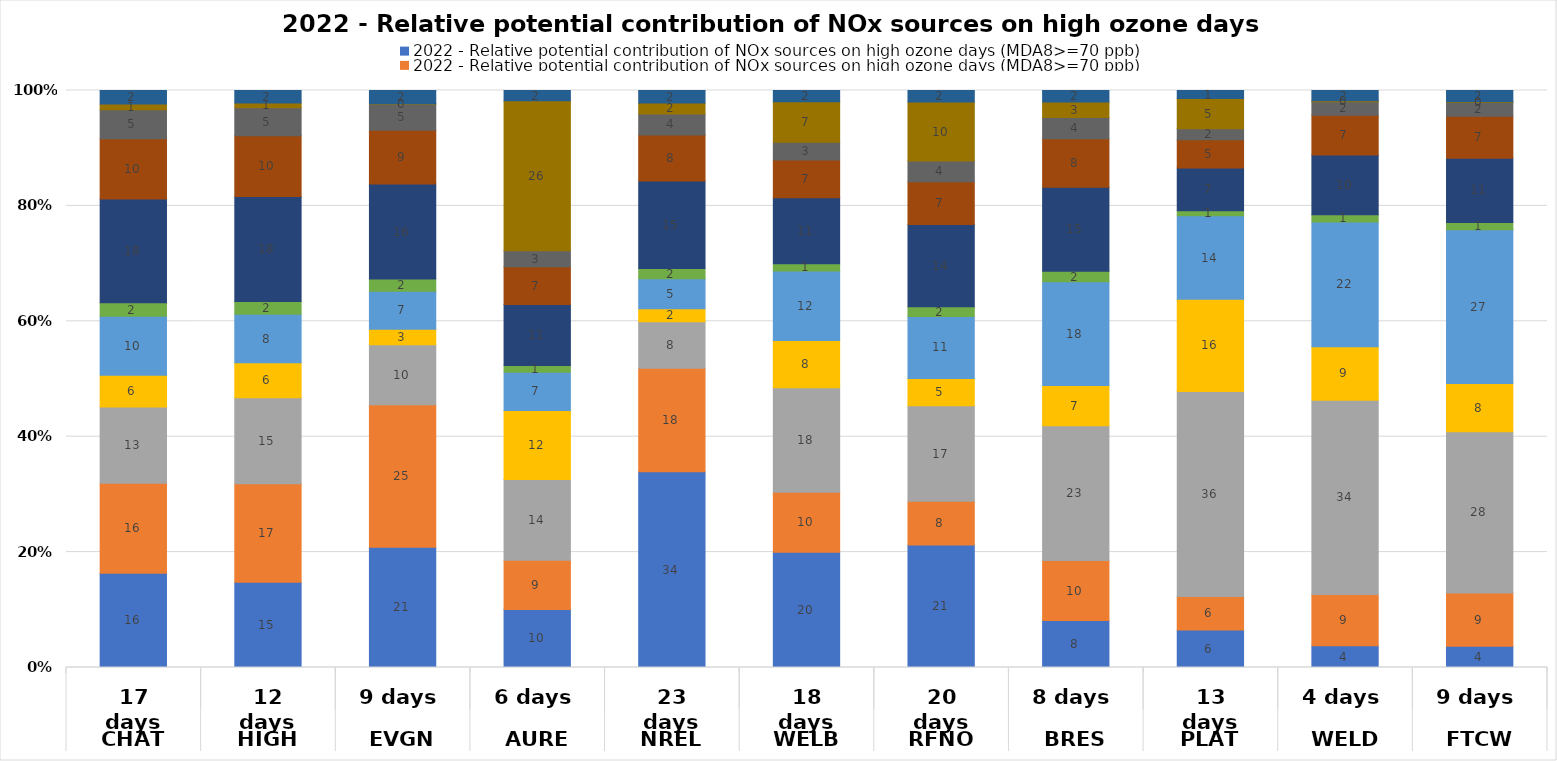
| Category | EGU Point | Non-EGU Point | O&G Area | O&G Point | O&G pre-production | Nonpoint | On-road Mobile | Other Non-road Mobile | Lawn & Garden Equipment | Airports | Rail |
|---|---|---|---|---|---|---|---|---|---|---|---|
| 0 | 16.313 | 15.605 | 13.244 | 5.505 | 10.202 | 2.337 | 18.007 | 10.417 | 5.023 | 0.996 | 2.351 |
| 1 | 14.762 | 17.088 | 14.905 | 6.065 | 8.383 | 2.246 | 18.194 | 10.494 | 4.868 | 0.81 | 2.185 |
| 2 | 20.833 | 24.686 | 10.408 | 2.698 | 6.561 | 2.132 | 16.47 | 9.313 | 4.527 | 0.088 | 2.284 |
| 3 | 10.055 | 8.516 | 14.014 | 11.974 | 6.603 | 1.179 | 10.588 | 6.51 | 2.793 | 25.974 | 1.793 |
| 4 | 33.911 | 17.93 | 8.088 | 2.236 | 5.201 | 1.787 | 15.167 | 7.966 | 3.657 | 1.886 | 2.17 |
| 5 | 19.966 | 10.422 | 18.088 | 8.212 | 12.029 | 1.278 | 11.397 | 6.548 | 3.09 | 7.022 | 1.948 |
| 6 | 21.236 | 7.564 | 16.561 | 4.737 | 10.745 | 1.682 | 14.233 | 7.416 | 3.597 | 10.233 | 1.996 |
| 7 | 8.139 | 10.402 | 23.373 | 6.944 | 17.977 | 1.823 | 14.58 | 8.4 | 3.702 | 2.647 | 2.013 |
| 8 | 6.485 | 5.812 | 35.557 | 15.95 | 14.486 | 0.865 | 7.4 | 4.889 | 1.929 | 5.228 | 1.4 |
| 9 | 3.777 | 8.861 | 33.696 | 9.241 | 21.634 | 1.241 | 10.362 | 6.88 | 2.378 | 0.14 | 1.789 |
| 10 | 3.671 | 9.258 | 27.922 | 8.373 | 26.649 | 1.242 | 11.144 | 7.261 | 2.38 | 0.13 | 1.969 |